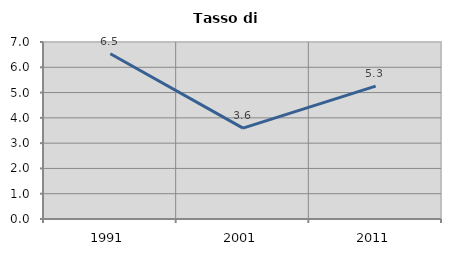
| Category | Tasso di disoccupazione   |
|---|---|
| 1991.0 | 6.535 |
| 2001.0 | 3.595 |
| 2011.0 | 5.254 |